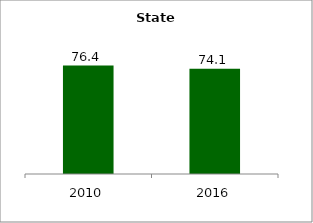
| Category | State |
|---|---|
| 2010.0 | 76.394 |
| 2016.0 | 74.104 |